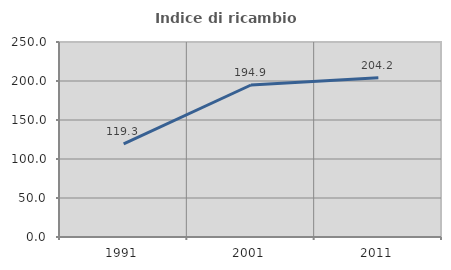
| Category | Indice di ricambio occupazionale  |
|---|---|
| 1991.0 | 119.31 |
| 2001.0 | 194.872 |
| 2011.0 | 204.242 |